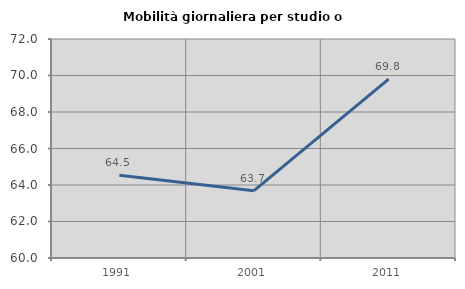
| Category | Mobilità giornaliera per studio o lavoro |
|---|---|
| 1991.0 | 64.538 |
| 2001.0 | 63.688 |
| 2011.0 | 69.806 |